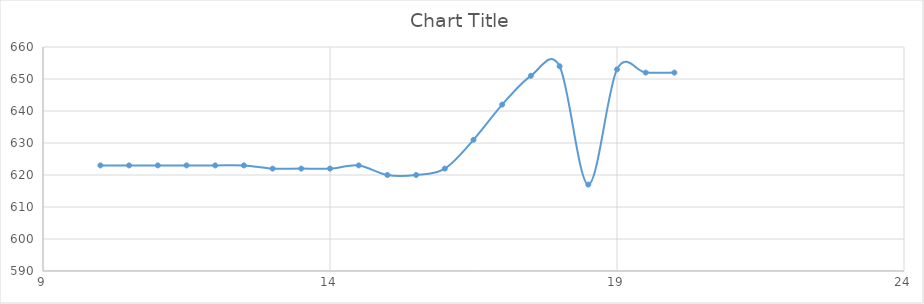
| Category | Series 0 |
|---|---|
| 20.0 | 652 |
| 19.5 | 652 |
| 19.0 | 653 |
| 18.5 | 617 |
| 18.0 | 654 |
| 17.5 | 651 |
| 17.0 | 642 |
| 16.5 | 631 |
| 16.0 | 622 |
| 15.5 | 620 |
| 15.0 | 620 |
| 14.5 | 623 |
| 14.0 | 622 |
| 13.5 | 622 |
| 13.0 | 622 |
| 12.5 | 623 |
| 12.0 | 623 |
| 11.5 | 623 |
| 11.0 | 623 |
| 10.5 | 623 |
| 10.0 | 623 |